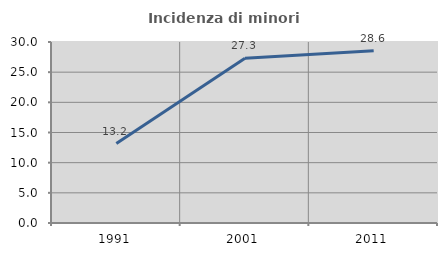
| Category | Incidenza di minori stranieri |
|---|---|
| 1991.0 | 13.158 |
| 2001.0 | 27.322 |
| 2011.0 | 28.553 |